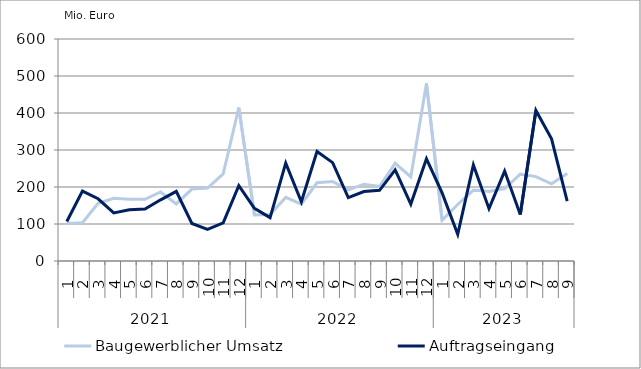
| Category | Baugewerblicher Umsatz | Auftragseingang |
|---|---|---|
| 0 | 101295.895 | 106850.127 |
| 1 | 103236.543 | 188883.434 |
| 2 | 156172.725 | 168204.42 |
| 3 | 169257.088 | 130052.073 |
| 4 | 166897.821 | 138492.214 |
| 5 | 166720.216 | 140262.426 |
| 6 | 186515.191 | 165331.191 |
| 7 | 154188.941 | 188169.655 |
| 8 | 194464.12 | 101359.538 |
| 9 | 197281.201 | 85626.862 |
| 10 | 235325.083 | 102880.924 |
| 11 | 414469.471 | 203900.676 |
| 12 | 124217.549 | 142351.759 |
| 13 | 125619.696 | 117194.423 |
| 14 | 171896.664 | 264509.013 |
| 15 | 153384.654 | 160146.519 |
| 16 | 211335.38 | 295997.826 |
| 17 | 214914.164 | 265813.917 |
| 18 | 192047.613 | 171529.517 |
| 19 | 207577.681 | 187809.656 |
| 20 | 201109.781 | 190941.096 |
| 21 | 264135.048 | 246250.021 |
| 22 | 227299.047 | 153783.993 |
| 23 | 480026.589 | 276019.328 |
| 24 | 110408.991 | 184068.731 |
| 25 | 152702.87 | 72330.186 |
| 26 | 191677.032 | 259741.102 |
| 27 | 187876.702 | 141464.389 |
| 28 | 195815.34 | 243069.898 |
| 29 | 234759.067 | 125882.939 |
| 30 | 228043.08 | 406932.293 |
| 31 | 208510.786 | 330128.024 |
| 32 | 236511.503 | 161760.047 |